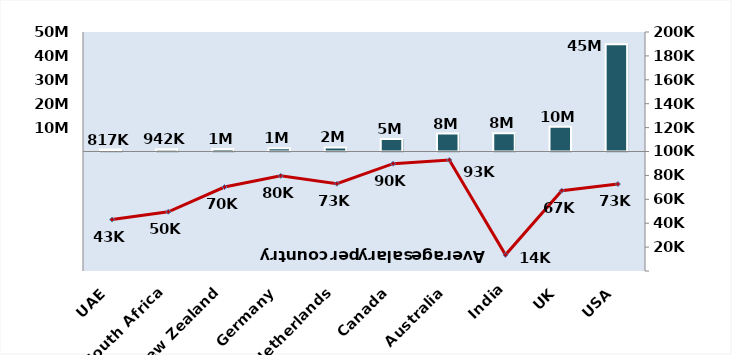
| Category | Series 0 |
|---|---|
| UAE | 817283.104 |
| South Africa | 941556.875 |
| New Zealand | 1054313.325 |
| Germany | 1353831.499 |
| Netherlands | 1679147.918 |
| Canada | 5208372.557 |
| Australia | 7521468.018 |
| India | 7644128.455 |
| UK | 10355072.437 |
| USA | 44879426 |